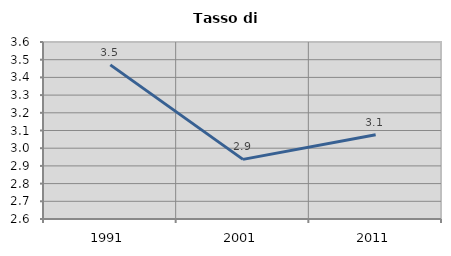
| Category | Tasso di disoccupazione   |
|---|---|
| 1991.0 | 3.471 |
| 2001.0 | 2.937 |
| 2011.0 | 3.076 |